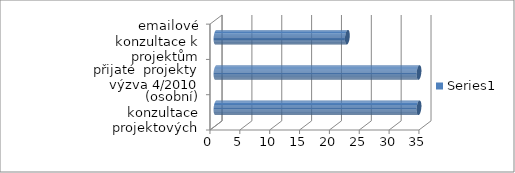
| Category | Series 0 |
|---|---|
| (osobní) konzultace projektových záměrů  | 34 |
| přijaté  projekty výzva 4/2010 | 34 |
| emailové konzultace k projektům | 22 |